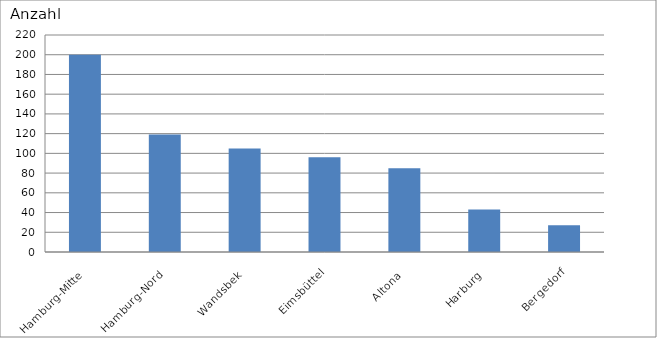
| Category | Hamburg-Mitte Hamburg-Nord Wandsbek Eimsbüttel Altona Harburg Bergedorf |
|---|---|
| Hamburg-Mitte | 200 |
| Hamburg-Nord | 119 |
| Wandsbek | 105 |
| Eimsbüttel | 96 |
| Altona | 85 |
| Harburg | 43 |
| Bergedorf | 27 |